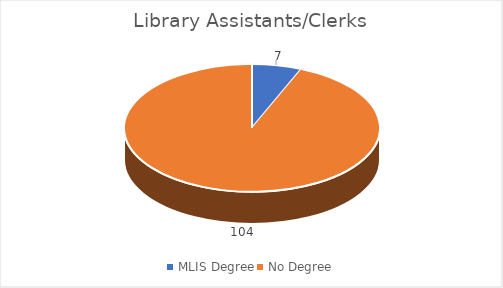
| Category | Series 0 |
|---|---|
| MLIS Degree | 7 |
| No Degree | 104 |